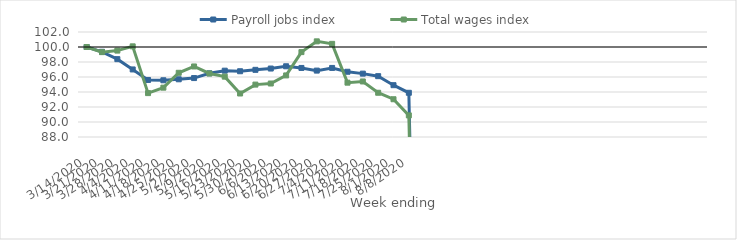
| Category | Payroll jobs index | Total wages index |
|---|---|---|
| 14/03/2020 | 100 | 100 |
| 21/03/2020 | 99.362 | 99.315 |
| 28/03/2020 | 98.378 | 99.52 |
| 04/04/2020 | 97.006 | 100.087 |
| 11/04/2020 | 95.605 | 93.851 |
| 18/04/2020 | 95.564 | 94.579 |
| 25/04/2020 | 95.695 | 96.562 |
| 02/05/2020 | 95.858 | 97.404 |
| 09/05/2020 | 96.49 | 96.469 |
| 16/05/2020 | 96.842 | 96.046 |
| 23/05/2020 | 96.768 | 93.802 |
| 30/05/2020 | 96.954 | 94.986 |
| 06/06/2020 | 97.128 | 95.133 |
| 13/06/2020 | 97.431 | 96.211 |
| 20/06/2020 | 97.208 | 99.32 |
| 27/06/2020 | 96.853 | 100.752 |
| 04/07/2020 | 97.208 | 100.419 |
| 11/07/2020 | 96.7 | 95.245 |
| 18/07/2020 | 96.45 | 95.406 |
| 25/07/2020 | 96.112 | 93.899 |
| 01/08/2020 | 94.91 | 93.034 |
| 08/08/2020 | 93.896 | 90.883 |